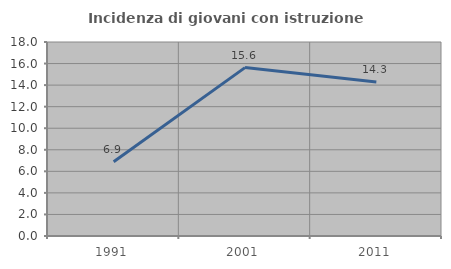
| Category | Incidenza di giovani con istruzione universitaria |
|---|---|
| 1991.0 | 6.897 |
| 2001.0 | 15.625 |
| 2011.0 | 14.286 |